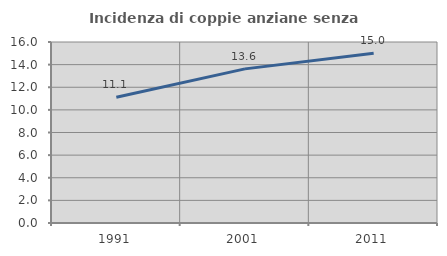
| Category | Incidenza di coppie anziane senza figli  |
|---|---|
| 1991.0 | 11.118 |
| 2001.0 | 13.624 |
| 2011.0 | 15.005 |